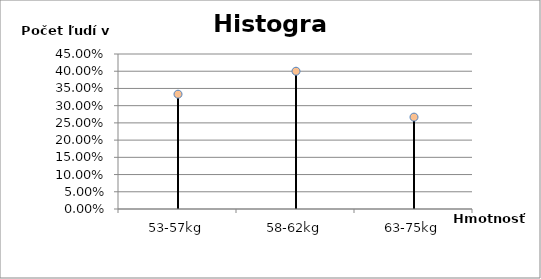
| Category | počet v % |
|---|---|
| 53-57kg | 0.333 |
| 58-62kg | 0.4 |
| 63-75kg | 0.267 |